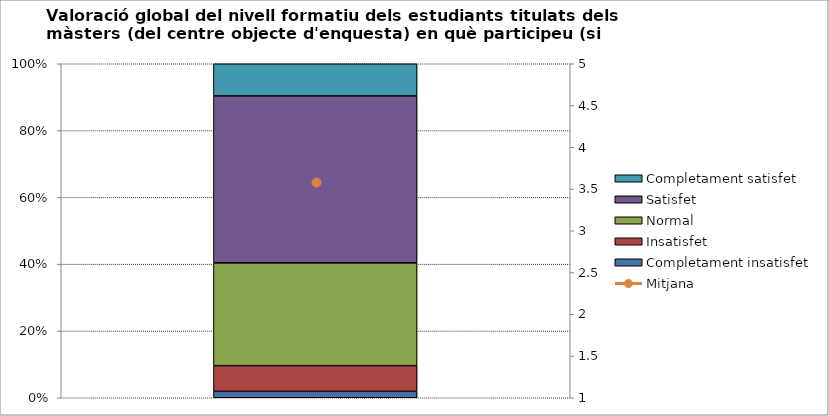
| Category | Completament insatisfet | Insatisfet | Normal | Satisfet | Completament satisfet |
|---|---|---|---|---|---|
| 0 | 1 | 4 | 16 | 26 | 5 |